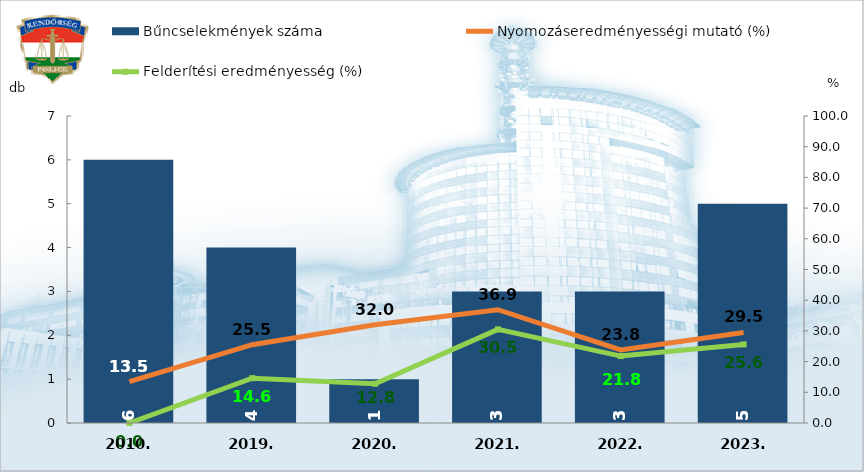
| Category | Bűncselekmények száma |
|---|---|
| 2010. | 6 |
| 2019. | 4 |
| 2020. | 1 |
| 2021. | 3 |
| 2022. | 3 |
| 2023. | 5 |